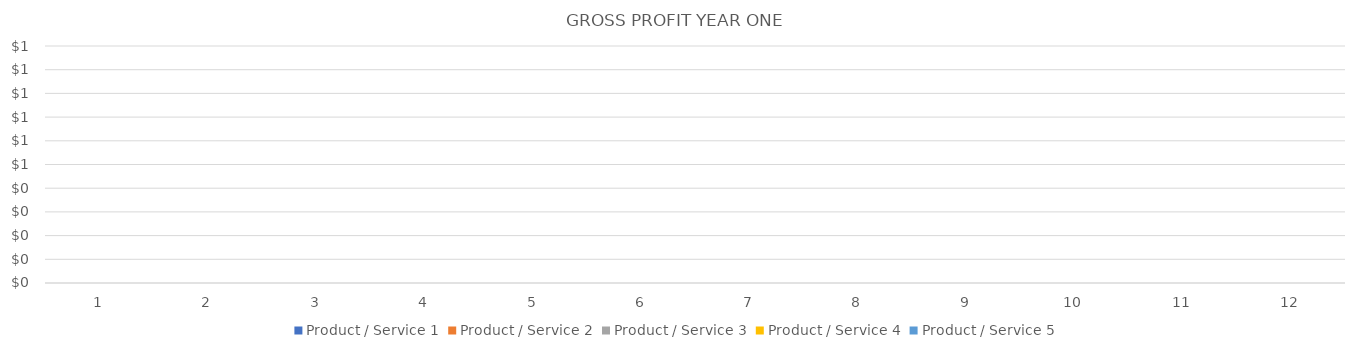
| Category | Product / Service 1 | Product / Service 2 | Product / Service 3 | Product / Service 4 | Product / Service 5 |
|---|---|---|---|---|---|
| 0 | 0 | 0 | 0 | 0 | 0 |
| 1 | 0 | 0 | 0 | 0 | 0 |
| 2 | 0 | 0 | 0 | 0 | 0 |
| 3 | 0 | 0 | 0 | 0 | 0 |
| 4 | 0 | 0 | 0 | 0 | 0 |
| 5 | 0 | 0 | 0 | 0 | 0 |
| 6 | 0 | 0 | 0 | 0 | 0 |
| 7 | 0 | 0 | 0 | 0 | 0 |
| 8 | 0 | 0 | 0 | 0 | 0 |
| 9 | 0 | 0 | 0 | 0 | 0 |
| 10 | 0 | 0 | 0 | 0 | 0 |
| 11 | 0 | 0 | 0 | 0 | 0 |